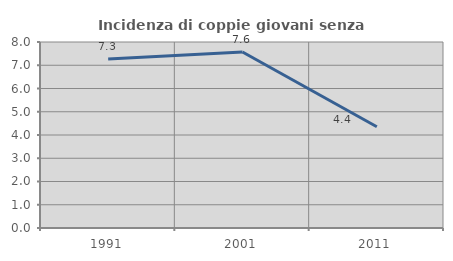
| Category | Incidenza di coppie giovani senza figli |
|---|---|
| 1991.0 | 7.267 |
| 2001.0 | 7.568 |
| 2011.0 | 4.353 |